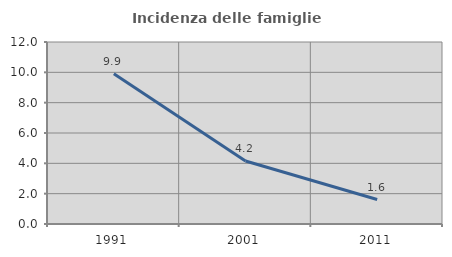
| Category | Incidenza delle famiglie numerose |
|---|---|
| 1991.0 | 9.9 |
| 2001.0 | 4.153 |
| 2011.0 | 1.611 |